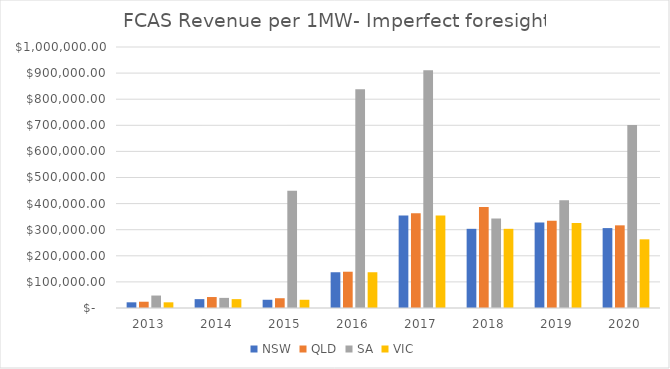
| Category | NSW | QLD | SA | VIC |
|---|---|---|---|---|
| 2013.0 | 21785 | 24040.5 | 47746 | 21785 |
| 2014.0 | 33965.5 | 42036.5 | 38784.5 | 33965.5 |
| 2015.0 | 31539.5 | 37452.5 | 449421.5 | 31539.5 |
| 2016.0 | 136981 | 138991.5 | 837860 | 136981 |
| 2017.0 | 353947 | 363434 | 910610 | 353947 |
| 2018.0 | 303372.5 | 386949.5 | 342536 | 303372.5 |
| 2019.0 | 327809.5 | 334589.5 | 412484.5 | 326082.5 |
| 2020.0 | 306171.5 | 316698.5 | 701293.5 | 263116 |